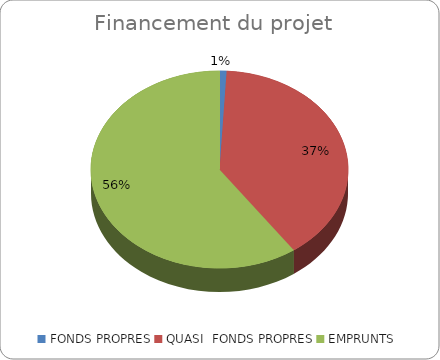
| Category | Series 0 |
|---|---|
| FONDS PROPRES | 0.008 |
| QUASI  FONDS PROPRES | 0.369 |
| EMPRUNTS | 0.561 |